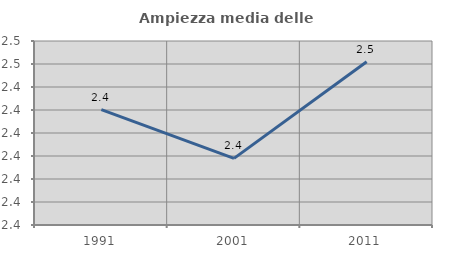
| Category | Ampiezza media delle famiglie |
|---|---|
| 1991.0 | 2.43 |
| 2001.0 | 2.409 |
| 2011.0 | 2.451 |